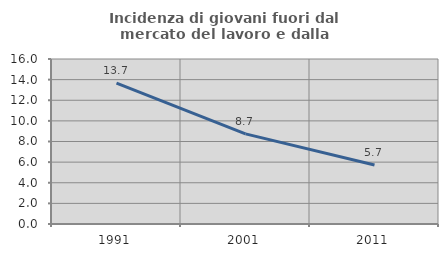
| Category | Incidenza di giovani fuori dal mercato del lavoro e dalla formazione  |
|---|---|
| 1991.0 | 13.669 |
| 2001.0 | 8.738 |
| 2011.0 | 5.714 |